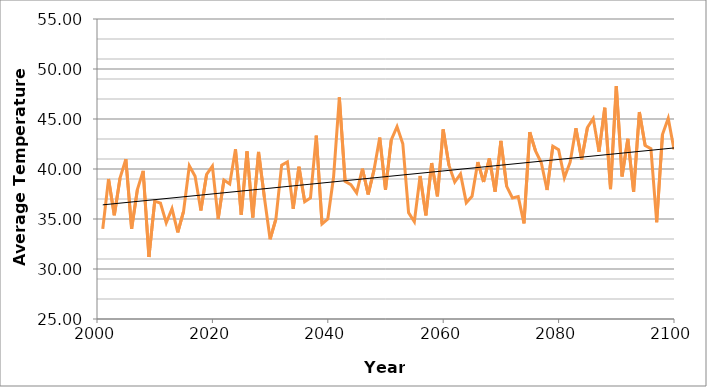
| Category | A2 |
|---|---|
| 2001.0 | 34.014 |
| 2002.0 | 39.002 |
| 2003.0 | 35.379 |
| 2004.0 | 39.11 |
| 2005.0 | 40.978 |
| 2006.0 | 34.016 |
| 2007.0 | 37.94 |
| 2008.0 | 39.812 |
| 2009.0 | 31.199 |
| 2010.0 | 36.775 |
| 2011.0 | 36.592 |
| 2012.0 | 34.621 |
| 2013.0 | 36.036 |
| 2014.0 | 33.654 |
| 2015.0 | 35.755 |
| 2016.0 | 40.318 |
| 2017.0 | 39.265 |
| 2018.0 | 35.841 |
| 2019.0 | 39.465 |
| 2020.0 | 40.296 |
| 2021.0 | 34.993 |
| 2022.0 | 38.899 |
| 2023.0 | 38.5 |
| 2024.0 | 41.965 |
| 2025.0 | 35.425 |
| 2026.0 | 41.77 |
| 2027.0 | 35.15 |
| 2028.0 | 41.706 |
| 2029.0 | 37.197 |
| 2030.0 | 32.977 |
| 2031.0 | 34.988 |
| 2032.0 | 40.379 |
| 2033.0 | 40.701 |
| 2034.0 | 36.025 |
| 2035.0 | 40.231 |
| 2036.0 | 36.72 |
| 2037.0 | 37.11 |
| 2038.0 | 43.34 |
| 2039.0 | 34.513 |
| 2040.0 | 34.997 |
| 2041.0 | 39.2 |
| 2042.0 | 47.161 |
| 2043.0 | 38.772 |
| 2044.0 | 38.437 |
| 2045.0 | 37.618 |
| 2046.0 | 40.03 |
| 2047.0 | 37.454 |
| 2048.0 | 39.886 |
| 2049.0 | 43.144 |
| 2050.0 | 37.918 |
| 2051.0 | 42.915 |
| 2052.0 | 44.24 |
| 2053.0 | 42.528 |
| 2054.0 | 35.634 |
| 2055.0 | 34.723 |
| 2056.0 | 39.308 |
| 2057.0 | 35.364 |
| 2058.0 | 40.59 |
| 2059.0 | 37.272 |
| 2060.0 | 43.952 |
| 2061.0 | 40.356 |
| 2062.0 | 38.698 |
| 2063.0 | 39.506 |
| 2064.0 | 36.633 |
| 2065.0 | 37.274 |
| 2066.0 | 40.694 |
| 2067.0 | 38.701 |
| 2068.0 | 41.049 |
| 2069.0 | 37.735 |
| 2070.0 | 42.816 |
| 2071.0 | 38.264 |
| 2072.0 | 37.108 |
| 2073.0 | 37.242 |
| 2074.0 | 34.567 |
| 2075.0 | 43.678 |
| 2076.0 | 41.817 |
| 2077.0 | 40.627 |
| 2078.0 | 37.902 |
| 2079.0 | 42.282 |
| 2080.0 | 41.927 |
| 2081.0 | 39.115 |
| 2082.0 | 40.68 |
| 2083.0 | 44.069 |
| 2084.0 | 40.96 |
| 2085.0 | 44.15 |
| 2086.0 | 45.046 |
| 2087.0 | 41.711 |
| 2088.0 | 46.125 |
| 2089.0 | 37.989 |
| 2090.0 | 48.283 |
| 2091.0 | 39.258 |
| 2092.0 | 43.018 |
| 2093.0 | 37.72 |
| 2094.0 | 45.689 |
| 2095.0 | 42.355 |
| 2096.0 | 42.042 |
| 2097.0 | 34.675 |
| 2098.0 | 43.441 |
| 2099.0 | 45.068 |
| 2100.0 | 41.952 |